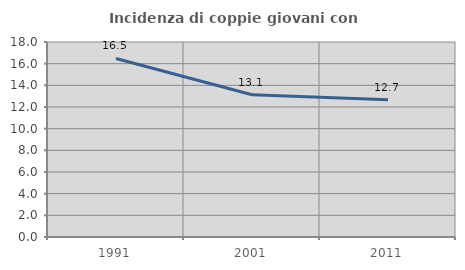
| Category | Incidenza di coppie giovani con figli |
|---|---|
| 1991.0 | 16.484 |
| 2001.0 | 13.127 |
| 2011.0 | 12.67 |